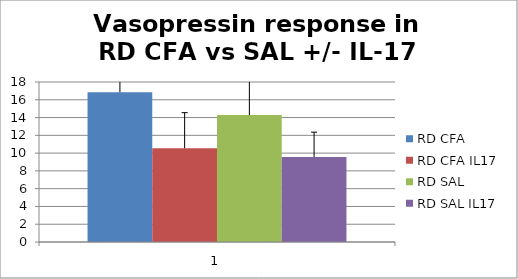
| Category | RD CFA | RD CFA IL17 | RD SAL | RD SAL IL17 |
|---|---|---|---|---|
| 0 | 16.85 | 10.55 | 14.278 | 9.556 |